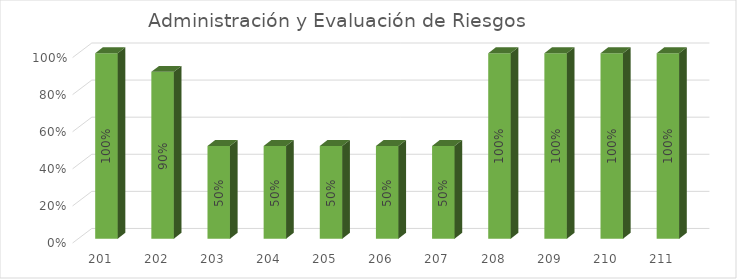
| Category | % Avance |
|---|---|
| 201.0 | 1 |
| 202.0 | 0.9 |
| 203.0 | 0.5 |
| 204.0 | 0.5 |
| 205.0 | 0.5 |
| 206.0 | 0.5 |
| 207.0 | 0.5 |
| 208.0 | 1 |
| 209.0 | 1 |
| 210.0 | 1 |
| 211.0 | 1 |